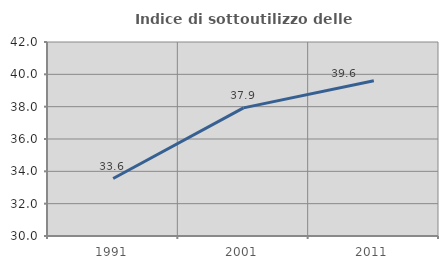
| Category | Indice di sottoutilizzo delle abitazioni  |
|---|---|
| 1991.0 | 33.556 |
| 2001.0 | 37.925 |
| 2011.0 | 39.605 |